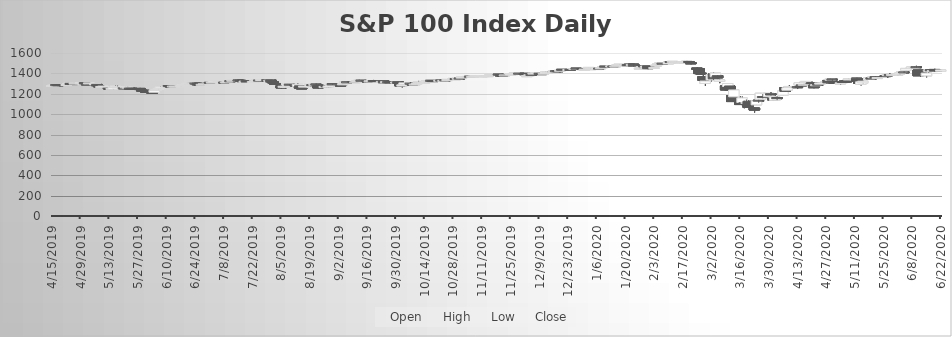
| Category | Open | High | Low | Close |
|---|---|---|---|---|
| 4/15/19 | 1281.5 | 1282.1 | 1276.22 | 1281.62 |
| 4/16/19 | 1284.47 | 1286.82 | 1282.06 | 1285.1 |
| 4/17/19 | 1289.25 | 1290.33 | 1283.62 | 1286.13 |
| 4/18/19 | 1288.2 | 1288.9 | 1282.05 | 1287.4 |
| 4/22/19 | 1284.19 | 1291.24 | 1283.23 | 1290.69 |
| 4/23/19 | 1291.16 | 1302.51 | 1290.37 | 1301.56 |
| 4/24/19 | 1301.02 | 1301.58 | 1296.48 | 1297.02 |
| 4/25/19 | 1300.13 | 1302.39 | 1293.5 | 1298.54 |
| 4/26/19 | 1298.68 | 1304.15 | 1294.56 | 1304.15 |
| 4/29/19 | 1304.67 | 1309.64 | 1304.23 | 1307.07 |
| 4/30/19 | 1302.46 | 1306.35 | 1296.48 | 1305.2 |
| 5/1/19 | 1309.35 | 1311.46 | 1297.41 | 1297.69 |
| 5/2/19 | 1297.07 | 1300.36 | 1285.9 | 1292.88 |
| 5/3/19 | 1299.26 | 1308.25 | 1299.26 | 1306.72 |
| 5/6/19 | 1288.53 | 1302.45 | 1284.25 | 1300.44 |
| 5/7/19 | 1291.75 | 1292.06 | 1268.86 | 1278.76 |
| 5/8/19 | 1276.64 | 1285.01 | 1273.3 | 1276.4 |
| 5/9/19 | 1267.48 | 1273.77 | 1256.43 | 1271.22 |
| 5/10/19 | 1267.91 | 1280.04 | 1250.62 | 1275.1 |
| 5/13/19 | 1254.83 | 1254.94 | 1239.79 | 1243.47 |
| 5/14/19 | 1247.31 | 1260.88 | 1246.74 | 1252.41 |
| 5/15/19 | 1246.22 | 1265.56 | 1244.56 | 1262.3 |
| 5/16/19 | 1264.39 | 1281.45 | 1264.39 | 1274.32 |
| 5/17/19 | 1266.24 | 1279.13 | 1264.21 | 1267.41 |
| 5/20/19 | 1258.95 | 1264.75 | 1254.44 | 1258.85 |
| 5/21/19 | 1264.91 | 1269.87 | 1263.62 | 1267.75 |
| 5/22/19 | 1263.83 | 1268.58 | 1262.07 | 1264.15 |
| 5/23/19 | 1255.57 | 1255.57 | 1241.48 | 1249.31 |
| 5/24/19 | 1253.57 | 1257.32 | 1248.19 | 1250.67 |
| 5/28/19 | 1252.35 | 1257.25 | 1240.71 | 1240.99 |
| 5/29/19 | 1235.24 | 1235.8 | 1224.01 | 1231.97 |
| 5/30/19 | 1233.86 | 1237.29 | 1228.16 | 1233.67 |
| 5/31/19 | 1223.46 | 1223.48 | 1214.35 | 1215.02 |
| 6/3/19 | 1213.54 | 1216.71 | 1199.74 | 1206.83 |
| 6/4/19 | 1214.86 | 1233.65 | 1214.86 | 1232.95 |
| 6/5/19 | 1239.56 | 1242 | 1231.62 | 1241.46 |
| 6/6/19 | 1242.8 | 1254.16 | 1240.55 | 1250.21 |
| 6/7/19 | 1254.28 | 1270.79 | 1254.28 | 1265.65 |
| 6/10/19 | 1272.07 | 1281.5 | 1271.85 | 1272.58 |
| 6/11/19 | 1280.12 | 1284 | 1270.8 | 1273.58 |
| 6/12/19 | 1271.88 | 1274.46 | 1268.31 | 1270.39 |
| 6/13/19 | 1273.24 | 1277.76 | 1271.3 | 1275.45 |
| 6/14/19 | 1273.66 | 1278.08 | 1270.88 | 1274.4 |
| 6/17/19 | 1275.79 | 1280.22 | 1274.45 | 1277.35 |
| 6/18/19 | 1285.66 | 1295.32 | 1284.67 | 1289.69 |
| 6/19/19 | 1291.19 | 1294.85 | 1285.83 | 1292.32 |
| 6/20/19 | 1303.19 | 1307 | 1294.99 | 1305.05 |
| 6/21/19 | 1304.26 | 1311.13 | 1303.12 | 1304.36 |
| 6/24/19 | 1304.44 | 1306.67 | 1302.22 | 1302.82 |
| 6/25/19 | 1302.7 | 1302.96 | 1287.59 | 1288.61 |
| 6/26/19 | 1292.88 | 1296.7 | 1288.11 | 1288.83 |
| 6/27/19 | 1291.57 | 1295.12 | 1290.1 | 1292.25 |
| 6/28/19 | 1296.18 | 1298.42 | 1291.94 | 1297.46 |
| 7/1/19 | 1311.22 | 1314.53 | 1302.92 | 1307.95 |
| 7/2/19 | 1308.35 | 1313.72 | 1305.09 | 1313.63 |
| 7/3/19 | 1315.84 | 1323.16 | 1315.7 | 1323.16 |
| 7/5/19 | 1318.03 | 1322.8 | 1311.91 | 1320.77 |
| 7/8/19 | 1315.62 | 1315.77 | 1311.43 | 1314.36 |
| 7/9/19 | 1309.75 | 1317.96 | 1308.75 | 1316.79 |
| 7/10/19 | 1321.36 | 1328.39 | 1320.1 | 1324.5 |
| 7/11/19 | 1327.39 | 1329.31 | 1322.58 | 1326.71 |
| 7/12/19 | 1328.69 | 1332.35 | 1327.23 | 1332.32 |
| 7/15/19 | 1334.53 | 1334.53 | 1330.29 | 1333.24 |
| 7/16/19 | 1332.02 | 1333.73 | 1326.41 | 1328.17 |
| 7/17/19 | 1329.02 | 1329.77 | 1319.76 | 1319.85 |
| 7/18/19 | 1316.79 | 1324.95 | 1313.68 | 1323.72 |
| 7/19/19 | 1328.54 | 1329.86 | 1315.01 | 1315.42 |
| 7/22/19 | 1317.67 | 1322.03 | 1314.95 | 1320.12 |
| 7/23/19 | 1325.18 | 1328.82 | 1321.15 | 1328.49 |
| 7/24/19 | 1324.54 | 1334.52 | 1324.14 | 1334.49 |
| 7/25/19 | 1333.87 | 1334.17 | 1325.04 | 1328.03 |
| 7/26/19 | 1333.29 | 1340.99 | 1333.07 | 1339.87 |
| 7/29/19 | 1338.83 | 1339.47 | 1334.53 | 1337.77 |
| 7/30/19 | 1331.94 | 1335.45 | 1328.81 | 1332.65 |
| 7/31/19 | 1334.67 | 1334.83 | 1307.58 | 1317.09 |
| 8/1/19 | 1318.19 | 1334.01 | 1302.29 | 1305.66 |
| 8/2/19 | 1300.87 | 1301.49 | 1287.66 | 1296.65 |
| 8/5/19 | 1279.48 | 1279.48 | 1246.91 | 1256.99 |
| 8/6/19 | 1265.06 | 1274.87 | 1258.43 | 1273.35 |
| 8/7/19 | 1262.41 | 1276.51 | 1247.05 | 1273 |
| 8/8/19 | 1278.88 | 1296.96 | 1277.49 | 1296.68 |
| 8/9/19 | 1293.4 | 1295.56 | 1278.97 | 1287.65 |
| 8/12/19 | 1282.22 | 1282.92 | 1267.74 | 1272.4 |
| 8/13/19 | 1271.82 | 1300.04 | 1270.39 | 1292.61 |
| 8/14/19 | 1278.14 | 1278.14 | 1254.59 | 1255.1 |
| 8/15/19 | 1256.9 | 1261.77 | 1246.74 | 1256.83 |
| 8/16/19 | 1265.13 | 1277.27 | 1265.13 | 1275.19 |
| 8/19/19 | 1285.54 | 1294.47 | 1285.54 | 1291.29 |
| 8/20/19 | 1289.49 | 1291.53 | 1280.4 | 1280.77 |
| 8/21/19 | 1291.01 | 1294.49 | 1289.35 | 1292.09 |
| 8/22/19 | 1294.62 | 1298.92 | 1283.09 | 1291.31 |
| 8/23/19 | 1285.06 | 1292.65 | 1251.33 | 1256.91 |
| 8/26/19 | 1265.19 | 1272.24 | 1261.52 | 1271.79 |
| 8/27/19 | 1278.52 | 1281.12 | 1263.86 | 1268.06 |
| 8/28/19 | 1264.72 | 1277.21 | 1260.6 | 1276.24 |
| 8/29/19 | 1285.84 | 1294.38 | 1283.36 | 1291.77 |
| 8/30/19 | 1297.21 | 1299.03 | 1286.04 | 1292.38 |
| 9/3/19 | 1284.69 | 1286.95 | 1276.67 | 1282.96 |
| 9/4/19 | 1290.93 | 1298.21 | 1289.76 | 1297.53 |
| 9/5/19 | 1307.96 | 1319.82 | 1307.96 | 1315.51 |
| 9/6/19 | 1317.13 | 1318.58 | 1312.68 | 1315.73 |
| 9/9/19 | 1320.1 | 1320.71 | 1312.55 | 1316.78 |
| 9/10/19 | 1313.22 | 1317.45 | 1308.02 | 1317.44 |
| 9/11/19 | 1318.47 | 1327.87 | 1316.56 | 1327.87 |
| 9/12/19 | 1331.54 | 1337.86 | 1327.81 | 1331.98 |
| 9/13/19 | 1332.27 | 1334.42 | 1328.74 | 1330.97 |
| 9/16/19 | 1326.06 | 1327.62 | 1321.42 | 1324.3 |
| 9/17/19 | 1323.37 | 1327.39 | 1322.15 | 1327.12 |
| 9/18/19 | 1325.15 | 1328.94 | 1315.66 | 1328.12 |
| 9/19/19 | 1329.96 | 1335.55 | 1326.84 | 1328.66 |
| 9/20/19 | 1329.34 | 1333.13 | 1318.48 | 1321.7 |
| 9/23/19 | 1318.3 | 1324.57 | 1317.33 | 1321.21 |
| 9/24/19 | 1326.1 | 1328.72 | 1305.19 | 1308.76 |
| 9/25/19 | 1310.42 | 1320.94 | 1303.1 | 1318.62 |
| 9/26/19 | 1318.78 | 1318.81 | 1307.97 | 1313.96 |
| 9/27/19 | 1317.96 | 1318.74 | 1301.5 | 1308.66 |
| 9/30/19 | 1311.05 | 1318.51 | 1311.05 | 1315.25 |
| 10/1/19 | 1318.4 | 1323.57 | 1300.15 | 1300.68 |
| 10/2/19 | 1294.47 | 1294.47 | 1271.71 | 1276.91 |
| 10/3/19 | 1276.4 | 1287.97 | 1262.81 | 1287.74 |
| 10/4/19 | 1291.51 | 1307.82 | 1291.5 | 1306.99 |
| 10/7/19 | 1303.61 | 1311.37 | 1300.23 | 1301.93 |
| 10/8/19 | 1294.27 | 1297.54 | 1282.65 | 1282.82 |
| 10/9/19 | 1290.39 | 1298.5 | 1288.75 | 1294.12 |
| 10/10/19 | 1293.74 | 1307.55 | 1293.22 | 1302.41 |
| 10/11/19 | 1313.23 | 1325.72 | 1313.23 | 1315.77 |
| 10/14/19 | 1313.93 | 1317.81 | 1312.76 | 1314.56 |
| 10/15/19 | 1317.73 | 1332.29 | 1317.73 | 1328.43 |
| 10/16/19 | 1325.87 | 1329.97 | 1324.66 | 1326.73 |
| 10/17/19 | 1331.21 | 1334.81 | 1326.7 | 1329.82 |
| 10/18/19 | 1329.23 | 1330.6 | 1317.99 | 1321.61 |
| 10/21/19 | 1325.73 | 1331.85 | 1325.73 | 1331.59 |
| 10/22/19 | 1333.79 | 1336.6 | 1327.33 | 1327.59 |
| 10/23/19 | 1327.18 | 1331.08 | 1325.13 | 1330.97 |
| 10/24/19 | 1336.06 | 1336.88 | 1329.15 | 1333.22 |
| 10/25/19 | 1329.13 | 1342.85 | 1328.62 | 1340.72 |
| 10/28/19 | 1345.35 | 1352.24 | 1345.35 | 1350.57 |
| 10/29/19 | 1349.28 | 1351.83 | 1345 | 1345.85 |
| 10/30/19 | 1348.14 | 1353.7 | 1343.96 | 1351.83 |
| 10/31/19 | 1353.88 | 1353.88 | 1343.35 | 1349.76 |
| 11/1/19 | 1354.6 | 1363.07 | 1354.6 | 1363.03 |
| 11/4/19 | 1367.83 | 1372.68 | 1367.79 | 1369.37 |
| 11/5/19 | 1370.98 | 1371.86 | 1367.08 | 1369.11 |
| 11/6/19 | 1369.16 | 1370.95 | 1365.09 | 1369.79 |
| 11/7/19 | 1374.12 | 1380.62 | 1372.32 | 1374.8 |
| 11/8/19 | 1373.43 | 1379.11 | 1369.92 | 1379.11 |
| 11/11/19 | 1373.83 | 1377.06 | 1371.24 | 1376.64 |
| 11/12/19 | 1377.33 | 1383.38 | 1375.16 | 1378.61 |
| 11/13/19 | 1375.78 | 1380.74 | 1373.01 | 1378.84 |
| 11/14/19 | 1377.01 | 1379.18 | 1372.07 | 1378.34 |
| 11/15/19 | 1382.76 | 1388.81 | 1381.52 | 1388.81 |
| 11/18/19 | 1388.01 | 1391.5 | 1384.08 | 1390.32 |
| 11/19/19 | 1392.42 | 1392.56 | 1385.41 | 1387.59 |
| 11/20/19 | 1385.5 | 1387.1 | 1374.08 | 1382.01 |
| 11/21/19 | 1381.72 | 1383.87 | 1376.46 | 1381.29 |
| 11/22/19 | 1384.11 | 1385.88 | 1379.87 | 1384.81 |
| 11/25/19 | 1388.11 | 1395.12 | 1388.11 | 1395 |
| 11/26/19 | 1396.27 | 1398.96 | 1394.39 | 1397.76 |
| 11/27/19 | 1400.24 | 1404.63 | 1399.44 | 1404.15 |
| 11/29/19 | 1401.28 | 1402.89 | 1398.09 | 1398.63 |
| 12/2/19 | 1400.21 | 1400.71 | 1384.42 | 1387.38 |
| 12/3/19 | 1375.1 | 1378.57 | 1366.59 | 1377.76 |
| 12/4/19 | 1382.99 | 1389.03 | 1381.74 | 1386.45 |
| 12/5/19 | 1389.75 | 1390.01 | 1382.17 | 1388.58 |
| 12/6/19 | 1395.98 | 1404.1 | 1395.98 | 1402.31 |
| 12/9/19 | 1400.3 | 1405.36 | 1398.04 | 1398.34 |
| 12/10/19 | 1397.78 | 1401.05 | 1392.88 | 1396.76 |
| 12/11/19 | 1398.16 | 1401.99 | 1397.09 | 1400.83 |
| 12/12/19 | 1400.36 | 1416.5 | 1399.22 | 1412.56 |
| 12/13/19 | 1412.23 | 1419.28 | 1408.07 | 1413.62 |
| 12/16/19 | 1419.98 | 1427.18 | 1419.98 | 1423.85 |
| 12/17/19 | 1425.8 | 1427.54 | 1424.36 | 1425.14 |
| 12/18/19 | 1425.99 | 1428.01 | 1423.08 | 1423.08 |
| 12/19/19 | 1423.42 | 1429.94 | 1423.42 | 1429.91 |
| 12/20/19 | 1439.55 | 1440.34 | 1434.42 | 1435.65 |
| 12/23/19 | 1437.67 | 1439.65 | 1437.26 | 1438 |
| 12/24/19 | 1438.45 | 1438.99 | 1436.21 | 1437.1 |
| 12/26/19 | 1438.79 | 1447.36 | 1438.79 | 1447.27 |
| 12/27/19 | 1450.82 | 1451.72 | 1444.83 | 1447.47 |
| 12/30/19 | 1447.63 | 1448.12 | 1436.24 | 1438.14 |
| 12/31/19 | 1435.07 | 1442.62 | 1433.29 | 1442.17 |
| 1/2/20 | 1448.49 | 1458.3 | 1446.44 | 1458.13 |
| 1/3/20 | 1443.23 | 1452.82 | 1440.78 | 1446.48 |
| 1/6/20 | 1437.77 | 1453.1 | 1436.23 | 1452.81 |
| 1/7/20 | 1450.94 | 1451.42 | 1446.33 | 1447.36 |
| 1/8/20 | 1447.53 | 1461.88 | 1446.73 | 1455.49 |
| 1/9/20 | 1462.14 | 1466.76 | 1460.91 | 1466.47 |
| 1/10/20 | 1469.81 | 1470.82 | 1460.1 | 1462.07 |
| 1/13/20 | 1465.23 | 1473.11 | 1463.54 | 1473.11 |
| 1/14/20 | 1472.06 | 1475.15 | 1467.13 | 1469.52 |
| 1/15/20 | 1469.53 | 1476.62 | 1468.18 | 1472.23 |
| 1/16/20 | 1478.57 | 1483.68 | 1477.68 | 1483.51 |
| 1/17/20 | 1487.26 | 1489.81 | 1484.15 | 1489.62 |
| 1/21/20 | 1486.03 | 1490.05 | 1483.71 | 1485.68 |
| 1/22/20 | 1489.73 | 1493.11 | 1486.13 | 1486.7 |
| 1/23/20 | 1484.79 | 1488.04 | 1478.47 | 1487.22 |
| 1/24/20 | 1491.08 | 1491.63 | 1468.64 | 1474.44 |
| 1/27/20 | 1450.7 | 1458.42 | 1445.42 | 1451.2 |
| 1/28/20 | 1456.17 | 1469.76 | 1455.34 | 1465.56 |
| 1/29/20 | 1473.27 | 1475.58 | 1464.94 | 1466.7 |
| 1/30/20 | 1459.56 | 1472.26 | 1452.78 | 1471.24 |
| 1/31/20 | 1473.56 | 1473.56 | 1441.66 | 1446.71 |
| 2/3/20 | 1450.93 | 1466.46 | 1450.93 | 1457.54 |
| 2/4/20 | 1472.22 | 1483.3 | 1472.08 | 1479.79 |
| 2/5/20 | 1492.68 | 1497.67 | 1485.76 | 1496.14 |
| 2/6/20 | 1500.76 | 1504.79 | 1496.98 | 1504.14 |
| 2/7/20 | 1499.61 | 1504.51 | 1494.94 | 1498.07 |
| 2/10/20 | 1492.96 | 1510.47 | 1492.77 | 1510.36 |
| 2/11/20 | 1516.19 | 1518.59 | 1505.82 | 1508.33 |
| 2/12/20 | 1514.13 | 1518.82 | 1513.25 | 1517.81 |
| 2/13/20 | 1510.78 | 1518.94 | 1507.82 | 1513.23 |
| 2/14/20 | 1515.19 | 1516.51 | 1509.23 | 1515.53 |
| 2/18/20 | 1509.78 | 1513.79 | 1504.2 | 1511.12 |
| 2/19/20 | 1515.63 | 1522.26 | 1514.32 | 1518.94 |
| 2/20/20 | 1516.68 | 1519.66 | 1496.78 | 1511.27 |
| 2/21/20 | 1505.49 | 1505.72 | 1489.15 | 1493.89 |
| 2/24/20 | 1452.18 | 1458.22 | 1436.11 | 1440.32 |
| 2/25/20 | 1446.16 | 1449.64 | 1393.39 | 1398.12 |
| 2/26/20 | 1402.44 | 1423.55 | 1390.6 | 1395.45 |
| 2/27/20 | 1368.69 | 1384.96 | 1330.83 | 1331.58 |
| 2/28/20 | 1301.39 | 1326.91 | 1276.77 | 1324.43 |
| 3/2/20 | 1335.29 | 1389.04 | 1322.37 | 1388.71 |
| 3/3/20 | 1393.63 | 1407.69 | 1334.79 | 1346.23 |
| 3/4/20 | 1366.64 | 1402.81 | 1359.21 | 1402.72 |
| 3/5/20 | 1377.53 | 1383.21 | 1345.89 | 1356.1 |
| 3/6/20 | 1321.33 | 1342.18 | 1304.22 | 1335.46 |
| 3/9/20 | 1277.38 | 1280.08 | 1234.05 | 1237.51 |
| 3/10/20 | 1271.36 | 1300.72 | 1234.08 | 1300.49 |
| 3/11/20 | 1276.5 | 1276.5 | 1223.6 | 1238.84 |
| 3/12/20 | 1182.16 | 1206.82 | 1122.99 | 1123.43 |
| 3/13/20 | 1169.89 | 1237.21 | 1134.42 | 1237.2 |
| 3/16/20 | 1126.07 | 1174.58 | 1090.71 | 1094.07 |
| 3/17/20 | 1114.07 | 1171.22 | 1087.58 | 1159.11 |
| 3/18/20 | 1111.51 | 1132.29 | 1058.09 | 1110.59 |
| 3/19/20 | 1110.29 | 1144.17 | 1079.3 | 1114.6 |
| 3/20/20 | 1125.77 | 1132.87 | 1061.53 | 1065.65 |
| 3/23/20 | 1060.3 | 1067.66 | 1015.63 | 1040 |
| 3/24/20 | 1090.79 | 1131.08 | 1089.75 | 1130.42 |
| 3/25/20 | 1136.44 | 1179.06 | 1110.75 | 1135.2 |
| 3/26/20 | 1146.72 | 1207.48 | 1146.51 | 1204.5 |
| 3/27/20 | 1172.55 | 1197.34 | 1155.12 | 1162.3 |
| 3/30/20 | 1171.27 | 1206.32 | 1167.93 | 1204.14 |
| 3/31/20 | 1200.31 | 1215.79 | 1181.97 | 1187.48 |
| 4/1/20 | 1151.48 | 1164.98 | 1129.53 | 1139.31 |
| 4/2/20 | 1135.35 | 1169.9 | 1131.68 | 1168.51 |
| 4/3/20 | 1163.01 | 1173.41 | 1137.93 | 1151.57 |
| 4/6/20 | 1186.39 | 1233.94 | 1186.38 | 1228.15 |
| 4/7/20 | 1260.3 | 1267.07 | 1221.77 | 1222.75 |
| 4/8/20 | 1234.73 | 1262.72 | 1223.61 | 1258.45 |
| 4/9/20 | 1270.03 | 1282.77 | 1259.98 | 1271.2 |
| 4/13/20 | 1269.41 | 1270.36 | 1246.47 | 1266.47 |
| 4/14/20 | 1284.82 | 1310.01 | 1284.82 | 1307.09 |
| 4/15/20 | 1287.45 | 1292.83 | 1273.17 | 1283.68 |
| 4/16/20 | 1291.94 | 1296.87 | 1277.18 | 1292.9 |
| 4/17/20 | 1309.23 | 1322.19 | 1300.97 | 1320.68 |
| 4/20/20 | 1309.8 | 1319.74 | 1299 | 1299.38 |
| 4/21/20 | 1285.24 | 1285.24 | 1254.57 | 1259.47 |
| 4/22/20 | 1283.19 | 1295.62 | 1279.18 | 1288.38 |
| 4/23/20 | 1293.86 | 1309.52 | 1286.95 | 1288.64 |
| 4/24/20 | 1294.34 | 1308.35 | 1286.05 | 1306.32 |
| 4/27/20 | 1314.11 | 1324.71 | 1312.81 | 1320.13 |
| 4/28/20 | 1330.64 | 1335.17 | 1305.91 | 1307.17 |
| 4/29/20 | 1332.94 | 1349.8 | 1329.21 | 1342.67 |
| 4/30/20 | 1343.89 | 1343.89 | 1326.81 | 1338.02 |
| 5/1/20 | 1319.13 | 1320.76 | 1298.21 | 1302.16 |
| 5/4/20 | 1296.26 | 1308.48 | 1288.12 | 1307.81 |
| 5/5/20 | 1320.07 | 1332.59 | 1316.6 | 1318.69 |
| 5/6/20 | 1325.05 | 1329.24 | 1312.87 | 1313.03 |
| 5/7/20 | 1325.83 | 1333.53 | 1322.83 | 1325.44 |
| 5/8/20 | 1336.12 | 1346.07 | 1333.98 | 1345.19 |
| 5/11/20 | 1340.29 | 1354.43 | 1334.5 | 1348.41 |
| 5/12/20 | 1352.56 | 1355.75 | 1322.51 | 1322.87 |
| 5/13/20 | 1322.08 | 1326.79 | 1290.24 | 1302.87 |
| 5/14/20 | 1292.56 | 1317.6 | 1282.58 | 1317.39 |
| 5/15/20 | 1307.01 | 1324.29 | 1301.6 | 1323.54 |
| 5/18/20 | 1341.39 | 1364.08 | 1341.39 | 1357.88 |
| 5/19/20 | 1355.85 | 1362.2 | 1343.84 | 1344.1 |
| 5/20/20 | 1357.87 | 1369.12 | 1357.87 | 1366.99 |
| 5/21/20 | 1367.36 | 1371.09 | 1352.91 | 1356.16 |
| 5/22/20 | 1355.46 | 1359.53 | 1349.41 | 1358.94 |
| 5/26/20 | 1378.33 | 1386.91 | 1368.47 | 1369.98 |
| 5/27/20 | 1377 | 1386.75 | 1356.77 | 1386.61 |
| 5/28/20 | 1389.11 | 1401.72 | 1380.06 | 1382.8 |
| 5/29/20 | 1382.06 | 1391.91 | 1369.05 | 1389.63 |
| 6/1/20 | 1386.09 | 1394.98 | 1381.94 | 1392.95 |
| 6/2/20 | 1396.09 | 1403.57 | 1389.38 | 1403.42 |
| 6/3/20 | 1409.43 | 1422.02 | 1408.49 | 1418.33 |
| 6/4/20 | 1414.62 | 1421.35 | 1404.08 | 1413.08 |
| 6/5/20 | 1431.39 | 1453.48 | 1431.39 | 1448.33 |
| 6/8/20 | 1450.46 | 1464.97 | 1447.44 | 1464.58 |
| 6/9/20 | 1458.6 | 1467.68 | 1451.93 | 1460.8 |
| 6/10/20 | 1465.16 | 1473.95 | 1455.55 | 1459.78 |
| 6/11/20 | 1432.68 | 1432.68 | 1376.47 | 1376.79 |
| 6/12/20 | 1405.67 | 1414.27 | 1368.86 | 1393.26 |
| 6/15/20 | 1375.41 | 1409.07 | 1361.41 | 1403.1 |
| 6/16/20 | 1427.46 | 1441.22 | 1408.46 | 1430.1 |
| 6/17/20 | 1435.4 | 1438.56 | 1423.45 | 1426.14 |
| 6/18/20 | 1421.99 | 1428.8 | 1417.48 | 1427.78 |
| 6/19/20 | 1438.42 | 1444.72 | 1414.23 | 1422.04 |
| 6/22/20 | 1421.49 | 1434.71 | 1416.01 | 1433.74 |